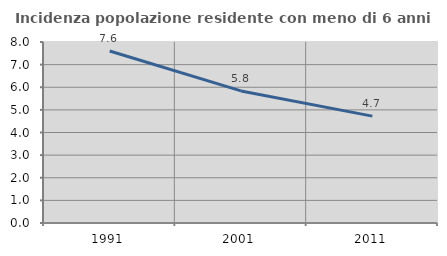
| Category | Incidenza popolazione residente con meno di 6 anni |
|---|---|
| 1991.0 | 7.602 |
| 2001.0 | 5.839 |
| 2011.0 | 4.723 |